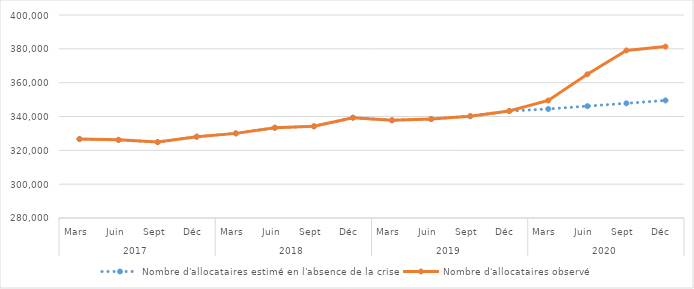
| Category | Nombre d'allocataires estimé en l'absence de la crise | Nombre d'allocataires observé |
|---|---|---|
| 0 | 326682 | 326682 |
| 1 | 326183 | 326183 |
| 2 | 324871 | 324871 |
| 3 | 328084 | 328084 |
| 4 | 330024 | 330024 |
| 5 | 333351 | 333351 |
| 6 | 334200 | 334200 |
| 7 | 339292 | 339292 |
| 8 | 337761 | 337761 |
| 9 | 338503 | 338503 |
| 10 | 340183 | 340183 |
| 11 | 343234 | 343234 |
| 12 | 344451.34 | 349471 |
| 13 | 346131.52 | 364970 |
| 14 | 347812.272 | 379054 |
| 15 | 349492.46 | 381317 |